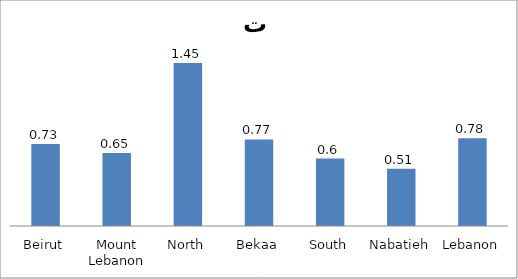
| Category | Series 0 |
|---|---|
| Beirut | 0.73 |
| Mount Lebanon | 0.65 |
| North | 1.45 |
| Bekaa | 0.77 |
| South | 0.6 |
| Nabatieh | 0.51 |
| Lebanon | 0.78 |